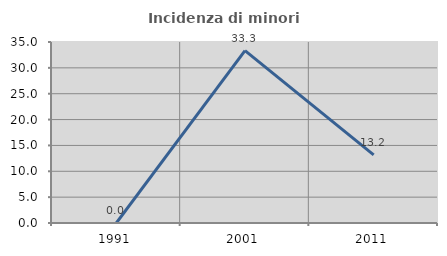
| Category | Incidenza di minori stranieri |
|---|---|
| 1991.0 | 0 |
| 2001.0 | 33.333 |
| 2011.0 | 13.158 |